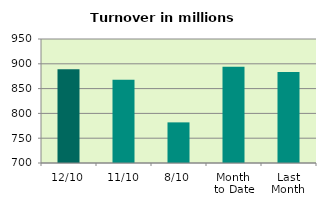
| Category | Series 0 |
|---|---|
| 12/10 | 889.14 |
| 11/10 | 867.991 |
| 8/10 | 781.909 |
| Month 
to Date | 894.073 |
| Last
Month | 883.598 |